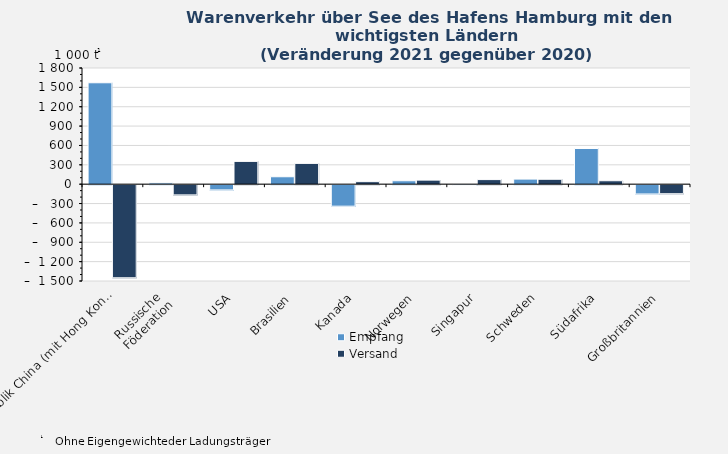
| Category | Empfang | Versand |
|---|---|---|
| Volksrepublik China (mit Hong Kong) | 1571 | -1442 |
| Russische 
Föderation | 20 | -158 |
| USA | -81 | 353 |
| Brasilien | 115 | 322 |
| Kanada | -333 | 39 |
| Norwegen | 53 | 63 |
| Singapur | -12 | 71 |
| Schweden | 79 | 76 |
| Südafrika | 553 | 53 |
| Großbritannien | -144 | -140 |